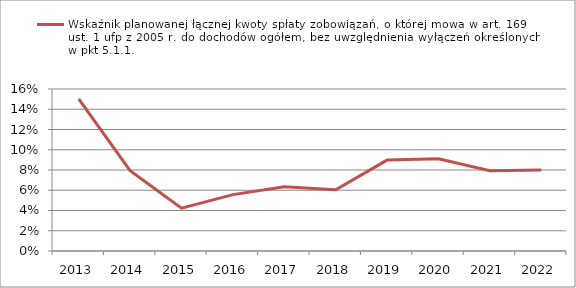
| Category | Wskaźnik planowanej łącznej kwoty spłaty zobowiązań, o której mowa w art. 169 ust. 1 ufp z 2005 r. do dochodów ogółem, bez uwzględnienia wyłączeń określonych w pkt 5.1.1.  |
|---|---|
| 2013.0 | 0.15 |
| 2014.0 | 0.079 |
| 2015.0 | 0.042 |
| 2016.0 | 0.056 |
| 2017.0 | 0.063 |
| 2018.0 | 0.06 |
| 2019.0 | 0.09 |
| 2020.0 | 0.091 |
| 2021.0 | 0.079 |
| 2022.0 | 0.08 |